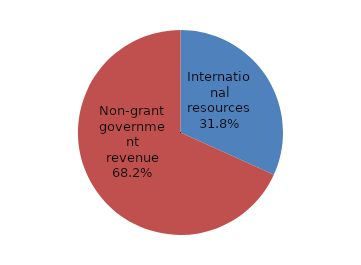
| Category | Series 0 |
|---|---|
| International resources | 4773.088 |
| Non-grant government revenue | 10247.202 |